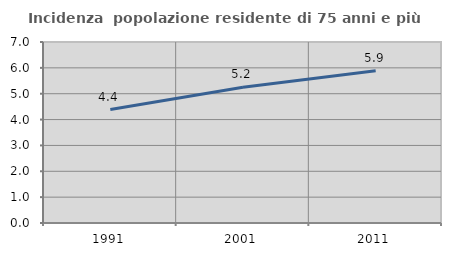
| Category | Incidenza  popolazione residente di 75 anni e più |
|---|---|
| 1991.0 | 4.389 |
| 2001.0 | 5.248 |
| 2011.0 | 5.888 |